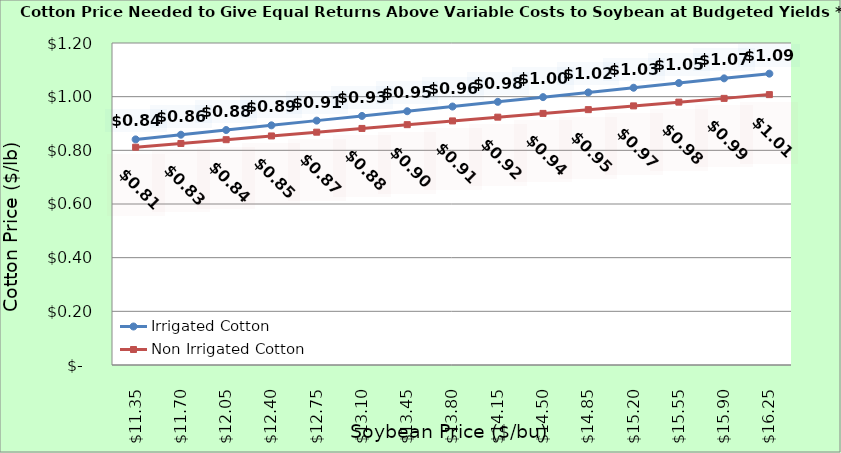
| Category | Irrigated Cotton | Non Irrigated Cotton |
|---|---|---|
| 11.350000000000003 | 0.841 | 0.812 |
| 11.700000000000003 | 0.858 | 0.826 |
| 12.050000000000002 | 0.876 | 0.84 |
| 12.400000000000002 | 0.893 | 0.854 |
| 12.750000000000002 | 0.911 | 0.868 |
| 13.100000000000001 | 0.928 | 0.882 |
| 13.450000000000001 | 0.946 | 0.896 |
| 13.8 | 0.963 | 0.91 |
| 14.15 | 0.981 | 0.924 |
| 14.5 | 0.998 | 0.938 |
| 14.85 | 1.016 | 0.952 |
| 15.2 | 1.033 | 0.966 |
| 15.549999999999999 | 1.051 | 0.98 |
| 15.899999999999999 | 1.068 | 0.994 |
| 16.25 | 1.086 | 1.008 |